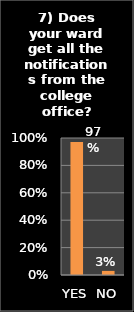
| Category | Series 0 |
|---|---|
| YES | 0.97 |
| NO | 0.03 |